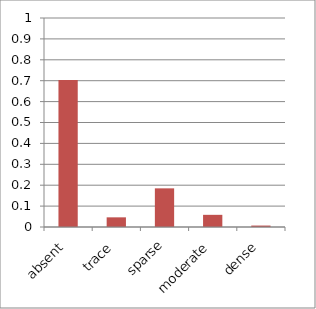
| Category | Fil green |
|---|---|
| absent | 0.704 |
| trace | 0.046 |
| sparse | 0.185 |
| moderate | 0.058 |
| dense | 0.007 |